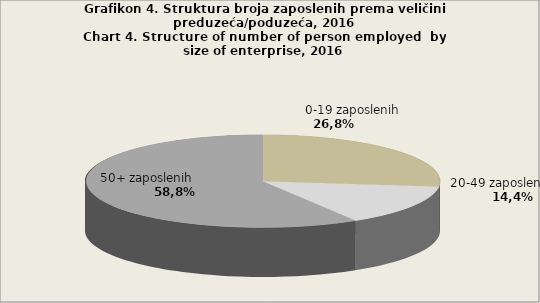
| Category | Series 0 |
|---|---|
| 0-19 zaposlenih | 77230 |
| 20-49 zaposlenih | 41547 |
| 50+ zaposlenih | 169192 |